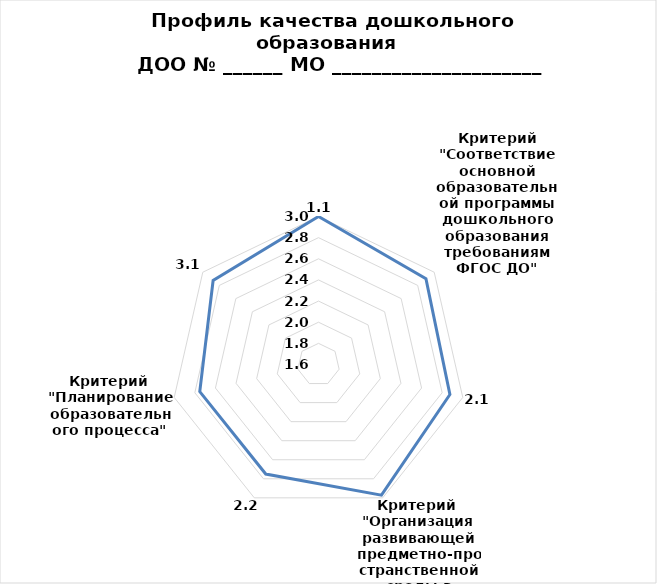
| Category | Series 0 |
|---|---|
| 0 | 3 |
| 1 | 2.9 |
| 2 | 2.875 |
| 3 | 2.972 |
| 4 | 2.75 |
| 5 | 2.752 |
| 6 | 2.875 |